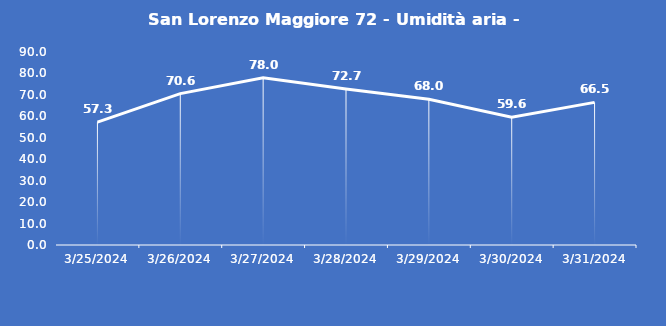
| Category | San Lorenzo Maggiore 72 - Umidità aria - Grezzo (%) |
|---|---|
| 3/25/24 | 57.3 |
| 3/26/24 | 70.6 |
| 3/27/24 | 78 |
| 3/28/24 | 72.7 |
| 3/29/24 | 68 |
| 3/30/24 | 59.6 |
| 3/31/24 | 66.5 |